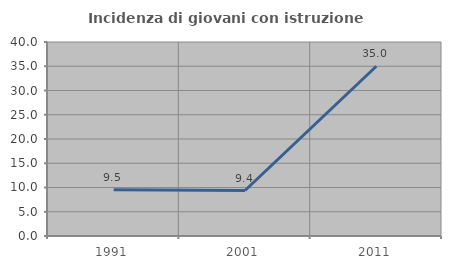
| Category | Incidenza di giovani con istruzione universitaria |
|---|---|
| 1991.0 | 9.524 |
| 2001.0 | 9.375 |
| 2011.0 | 35 |